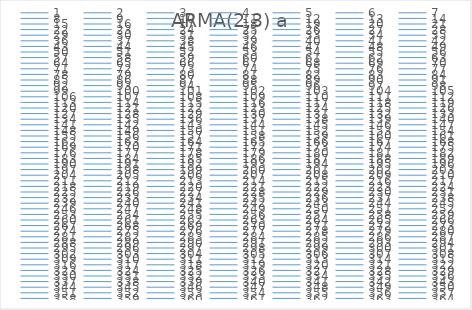
| Category | ARMA(2,3) a  |
|---|---|
| 0.0 | 0 |
| 1.0 | 7.794 |
| 2.0 | 12.601 |
| 3.0 | 17.953 |
| 4.0 | 21.77 |
| 5.0 | 25.87 |
| 6.0 | 32.054 |
| 7.0 | 37.475 |
| 8.0 | 42.303 |
| 9.0 | 49.031 |
| 10.0 | 55.45 |
| 11.0 | 59.478 |
| 12.0 | 64.986 |
| 13.0 | 70.694 |
| 14.0 | 74.901 |
| 15.0 | 79.23 |
| 16.0 | 83.968 |
| 17.0 | 86.77 |
| 18.0 | 88.888 |
| 19.0 | 91.46 |
| 20.0 | 92.942 |
| 21.0 | 94.544 |
| 22.0 | 95.835 |
| 23.0 | 96.282 |
| 24.0 | 96.475 |
| 25.0 | 97.259 |
| 26.0 | 97.453 |
| 27.0 | 96.441 |
| 28.0 | 95.998 |
| 29.0 | 95.129 |
| 30.0 | 95.203 |
| 31.0 | 95.311 |
| 32.0 | 93.866 |
| 33.0 | 91.935 |
| 34.0 | 91.52 |
| 35.0 | 92.834 |
| 36.0 | 94.592 |
| 37.0 | 96.752 |
| 38.0 | 99.857 |
| 39.0 | 101.391 |
| 40.0 | 100.674 |
| 41.0 | 100.138 |
| 42.0 | 100.266 |
| 43.0 | 98.245 |
| 44.0 | 98.259 |
| 45.0 | 98.516 |
| 46.0 | 98.723 |
| 47.0 | 98.543 |
| 48.0 | 100.384 |
| 49.0 | 100.889 |
| 50.0 | 102.037 |
| 51.0 | 103.242 |
| 52.0 | 103.194 |
| 53.0 | 101.319 |
| 54.0 | 100.912 |
| 55.0 | 100.323 |
| 56.0 | 99.451 |
| 57.0 | 99.741 |
| 58.0 | 99.537 |
| 59.0 | 99.758 |
| 60.0 | 98.079 |
| 61.0 | 97.338 |
| 62.0 | 95.978 |
| 63.0 | 93.319 |
| 64.0 | 93.238 |
| 65.0 | 91.168 |
| 66.0 | 92.265 |
| 67.0 | 91.516 |
| 68.0 | 90.677 |
| 69.0 | 91.973 |
| 70.0 | 91.537 |
| 71.0 | 92.245 |
| 72.0 | 92.043 |
| 73.0 | 92.254 |
| 74.0 | 93.431 |
| 75.0 | 94.503 |
| 76.0 | 96.322 |
| 77.0 | 96.967 |
| 78.0 | 98.2 |
| 79.0 | 98.437 |
| 80.0 | 99.387 |
| 81.0 | 99.817 |
| 82.0 | 99.515 |
| 83.0 | 100.018 |
| 84.0 | 100.638 |
| 85.0 | 101.052 |
| 86.0 | 101.987 |
| 87.0 | 101.364 |
| 88.0 | 101.602 |
| 89.0 | 100.753 |
| 90.0 | 100.196 |
| 91.0 | 97.392 |
| 92.0 | 97.691 |
| 93.0 | 98.051 |
| 94.0 | 97.191 |
| 95.0 | 97.803 |
| 96.0 | 96.838 |
| 97.0 | 96.532 |
| 98.0 | 96.48 |
| 99.0 | 99.626 |
| 100.0 | 99.211 |
| 101.0 | 99.186 |
| 102.0 | 98.372 |
| 103.0 | 96.849 |
| 104.0 | 95.379 |
| 105.0 | 93.13 |
| 106.0 | 91.353 |
| 107.0 | 91.171 |
| 108.0 | 90.478 |
| 109.0 | 89.985 |
| 110.0 | 88.52 |
| 111.0 | 87.248 |
| 112.0 | 85.574 |
| 113.0 | 85.933 |
| 114.0 | 86.871 |
| 115.0 | 85.96 |
| 116.0 | 87.074 |
| 117.0 | 85.955 |
| 118.0 | 87.117 |
| 119.0 | 88.237 |
| 120.0 | 88.99 |
| 121.0 | 91.332 |
| 122.0 | 92.473 |
| 123.0 | 94.111 |
| 124.0 | 96.195 |
| 125.0 | 96.07 |
| 126.0 | 98.466 |
| 127.0 | 97.225 |
| 128.0 | 95.275 |
| 129.0 | 93.196 |
| 130.0 | 92.028 |
| 131.0 | 92.406 |
| 132.0 | 92.429 |
| 133.0 | 92.631 |
| 134.0 | 92.942 |
| 135.0 | 92.453 |
| 136.0 | 92.55 |
| 137.0 | 93.86 |
| 138.0 | 93.576 |
| 139.0 | 93.943 |
| 140.0 | 95.942 |
| 141.0 | 98.279 |
| 142.0 | 99.734 |
| 143.0 | 101.28 |
| 144.0 | 103.09 |
| 145.0 | 100.051 |
| 146.0 | 98.867 |
| 147.0 | 99.808 |
| 148.0 | 97.844 |
| 149.0 | 98.317 |
| 150.0 | 99.068 |
| 151.0 | 98.301 |
| 152.0 | 99.457 |
| 153.0 | 101.034 |
| 154.0 | 101.153 |
| 155.0 | 101.041 |
| 156.0 | 98.778 |
| 157.0 | 97.199 |
| 158.0 | 96.054 |
| 159.0 | 94.038 |
| 160.0 | 93.606 |
| 161.0 | 93.676 |
| 162.0 | 94.171 |
| 163.0 | 94.338 |
| 164.0 | 95.591 |
| 165.0 | 96.187 |
| 166.0 | 97.043 |
| 167.0 | 98.848 |
| 168.0 | 100.043 |
| 169.0 | 100.109 |
| 170.0 | 100.928 |
| 171.0 | 100.674 |
| 172.0 | 102.066 |
| 173.0 | 103.141 |
| 174.0 | 102.471 |
| 175.0 | 101.841 |
| 176.0 | 101.892 |
| 177.0 | 99.362 |
| 178.0 | 99.536 |
| 179.0 | 99.466 |
| 180.0 | 97.756 |
| 181.0 | 96.181 |
| 182.0 | 92.699 |
| 183.0 | 91.862 |
| 184.0 | 89.313 |
| 185.0 | 88.378 |
| 186.0 | 88.877 |
| 187.0 | 87.583 |
| 188.0 | 86.966 |
| 189.0 | 87.319 |
| 190.0 | 86.967 |
| 191.0 | 86.343 |
| 192.0 | 85.551 |
| 193.0 | 83.185 |
| 194.0 | 82.953 |
| 195.0 | 83.132 |
| 196.0 | 83.944 |
| 197.0 | 84.589 |
| 198.0 | 87.242 |
| 199.0 | 87.013 |
| 200.0 | 86.541 |
| 201.0 | 87.718 |
| 202.0 | 88.077 |
| 203.0 | 87.853 |
| 204.0 | 87.232 |
| 205.0 | 87.787 |
| 206.0 | 88.393 |
| 207.0 | 89.657 |
| 208.0 | 91.712 |
| 209.0 | 94.129 |
| 210.0 | 95.067 |
| 211.0 | 96.627 |
| 212.0 | 97.468 |
| 213.0 | 96.607 |
| 214.0 | 96.581 |
| 215.0 | 96.264 |
| 216.0 | 94.787 |
| 217.0 | 94.958 |
| 218.0 | 96.608 |
| 219.0 | 95.645 |
| 220.0 | 96.846 |
| 221.0 | 98.18 |
| 222.0 | 97.005 |
| 223.0 | 97.122 |
| 224.0 | 97.414 |
| 225.0 | 96.844 |
| 226.0 | 96.601 |
| 227.0 | 97.396 |
| 228.0 | 96.959 |
| 229.0 | 98.084 |
| 230.0 | 96.511 |
| 231.0 | 94.766 |
| 232.0 | 92.702 |
| 233.0 | 92.402 |
| 234.0 | 93.286 |
| 235.0 | 95.671 |
| 236.0 | 98.337 |
| 237.0 | 100.522 |
| 238.0 | 101.332 |
| 239.0 | 100.406 |
| 240.0 | 102.637 |
| 241.0 | 102.964 |
| 242.0 | 103.839 |
| 243.0 | 102.624 |
| 244.0 | 103.594 |
| 245.0 | 103.27 |
| 246.0 | 103.745 |
| 247.0 | 105.333 |
| 248.0 | 106.592 |
| 249.0 | 106.268 |
| 250.0 | 108.332 |
| 251.0 | 108.424 |
| 252.0 | 110.146 |
| 253.0 | 109.518 |
| 254.0 | 107.796 |
| 255.0 | 105.803 |
| 256.0 | 103.267 |
| 257.0 | 101.583 |
| 258.0 | 100.633 |
| 259.0 | 99.095 |
| 260.0 | 98.099 |
| 261.0 | 98.62 |
| 262.0 | 97.946 |
| 263.0 | 99.392 |
| 264.0 | 99.823 |
| 265.0 | 99.653 |
| 266.0 | 99.159 |
| 267.0 | 99.851 |
| 268.0 | 98.843 |
| 269.0 | 96.77 |
| 270.0 | 95.823 |
| 271.0 | 94.802 |
| 272.0 | 94.42 |
| 273.0 | 95.259 |
| 274.0 | 97.293 |
| 275.0 | 98.367 |
| 276.0 | 99.866 |
| 277.0 | 101.522 |
| 278.0 | 101.975 |
| 279.0 | 101.259 |
| 280.0 | 101.433 |
| 281.0 | 100.038 |
| 282.0 | 100.925 |
| 283.0 | 100.362 |
| 284.0 | 99.09 |
| 285.0 | 98.907 |
| 286.0 | 99.108 |
| 287.0 | 99.378 |
| 288.0 | 100.058 |
| 289.0 | 101.5 |
| 290.0 | 101.778 |
| 291.0 | 102.761 |
| 292.0 | 102.746 |
| 293.0 | 101.994 |
| 294.0 | 99.396 |
| 295.0 | 97.285 |
| 296.0 | 96.743 |
| 297.0 | 96.652 |
| 298.0 | 96.514 |
| 299.0 | 96.416 |
| 300.0 | 94.607 |
| 301.0 | 91.26 |
| 302.0 | 89.824 |
| 303.0 | 87.394 |
| 304.0 | 86.41 |
| 305.0 | 86.211 |
| 306.0 | 86.848 |
| 307.0 | 87.721 |
| 308.0 | 88.198 |
| 309.0 | 88.722 |
| 310.0 | 90.344 |
| 311.0 | 91.469 |
| 312.0 | 93.48 |
| 313.0 | 95.239 |
| 314.0 | 96.633 |
| 315.0 | 98.927 |
| 316.0 | 100.812 |
| 317.0 | 100.829 |
| 318.0 | 102.282 |
| 319.0 | 102.847 |
| 320.0 | 103.233 |
| 321.0 | 104.574 |
| 322.0 | 105.215 |
| 323.0 | 105.237 |
| 324.0 | 104.54 |
| 325.0 | 103.032 |
| 326.0 | 102.627 |
| 327.0 | 103.04 |
| 328.0 | 103.239 |
| 329.0 | 104.67 |
| 330.0 | 104.252 |
| 331.0 | 104.495 |
| 332.0 | 103.368 |
| 333.0 | 102.837 |
| 334.0 | 100.971 |
| 335.0 | 98.34 |
| 336.0 | 97.414 |
| 337.0 | 96.59 |
| 338.0 | 95.409 |
| 339.0 | 96.224 |
| 340.0 | 97.194 |
| 341.0 | 95.798 |
| 342.0 | 94.405 |
| 343.0 | 94.379 |
| 344.0 | 93.211 |
| 345.0 | 92.723 |
| 346.0 | 92.422 |
| 347.0 | 94.069 |
| 348.0 | 95.743 |
| 349.0 | 98.169 |
| 350.0 | 99.267 |
| 351.0 | 98.438 |
| 352.0 | 99.029 |
| 353.0 | 97.824 |
| 354.0 | 98.477 |
| 355.0 | 100.131 |
| 356.0 | 100.512 |
| 357.0 | 101.664 |
| 358.0 | 102.447 |
| 359.0 | 103.948 |
| 360.0 | 103.963 |
| 361.0 | 105.289 |
| 362.0 | 106.718 |
| 363.0 | 106.156 |
| 364.0 | 104.759 |
| 365.0 | 104.92 |
| 366.0 | 104.204 |
| 367.0 | 102.352 |
| 368.0 | 102.318 |
| 369.0 | 101.019 |
| 370.0 | 99.207 |
| 371.0 | 99.741 |
| 372.0 | 98.606 |
| 373.0 | 98.337 |
| 374.0 | 98.57 |
| 375.0 | 97.71 |
| 376.0 | 97.04 |
| 377.0 | 96.796 |
| 378.0 | 97.68 |
| 379.0 | 98.226 |
| 380.0 | 97.89 |
| 381.0 | 97.644 |
| 382.0 | 96.413 |
| 383.0 | 96.186 |
| 384.0 | 95.755 |
| 385.0 | 95.655 |
| 386.0 | 95.546 |
| 387.0 | 94.75 |
| 388.0 | 95.172 |
| 389.0 | 95.201 |
| 390.0 | 98.062 |
| 391.0 | 100.119 |
| 392.0 | 101.105 |
| 393.0 | 101.834 |
| 394.0 | 102.233 |
| 395.0 | 101.495 |
| 396.0 | 104.789 |
| 397.0 | 105.955 |
| 398.0 | 105.728 |
| 399.0 | 107.392 |
| 400.0 | 107.385 |
| 401.0 | 106.813 |
| 402.0 | 106.297 |
| 403.0 | 105.256 |
| 404.0 | 106.105 |
| 405.0 | 105.743 |
| 406.0 | 106.77 |
| 407.0 | 105.737 |
| 408.0 | 104.016 |
| 409.0 | 103.37 |
| 410.0 | 100.733 |
| 411.0 | 100.525 |
| 412.0 | 99.689 |
| 413.0 | 100.581 |
| 414.0 | 102.914 |
| 415.0 | 103.017 |
| 416.0 | 102.82 |
| 417.0 | 101.366 |
| 418.0 | 99.292 |
| 419.0 | 98.487 |
| 420.0 | 98.199 |
| 421.0 | 99.462 |
| 422.0 | 100.151 |
| 423.0 | 99.615 |
| 424.0 | 100.648 |
| 425.0 | 101.061 |
| 426.0 | 101.232 |
| 427.0 | 104.174 |
| 428.0 | 103.922 |
| 429.0 | 105.525 |
| 430.0 | 104.046 |
| 431.0 | 104.14 |
| 432.0 | 105.109 |
| 433.0 | 103.867 |
| 434.0 | 106.16 |
| 435.0 | 105.636 |
| 436.0 | 103.609 |
| 437.0 | 103.386 |
| 438.0 | 100.44 |
| 439.0 | 100.387 |
| 440.0 | 100.865 |
| 441.0 | 100.816 |
| 442.0 | 101.278 |
| 443.0 | 102.147 |
| 444.0 | 102.067 |
| 445.0 | 102.482 |
| 446.0 | 103.689 |
| 447.0 | 103.18 |
| 448.0 | 102.832 |
| 449.0 | 103.72 |
| 450.0 | 103.807 |
| 451.0 | 104.667 |
| 452.0 | 103.83 |
| 453.0 | 101.406 |
| 454.0 | 99.868 |
| 455.0 | 99.044 |
| 456.0 | 99.641 |
| 457.0 | 101.199 |
| 458.0 | 103.271 |
| 459.0 | 102.584 |
| 460.0 | 99.835 |
| 461.0 | 98.465 |
| 462.0 | 97.941 |
| 463.0 | 99.003 |
| 464.0 | 99.6 |
| 465.0 | 98.355 |
| 466.0 | 98.003 |
| 467.0 | 96.402 |
| 468.0 | 94.791 |
| 469.0 | 93.86 |
| 470.0 | 93.522 |
| 471.0 | 93.045 |
| 472.0 | 91.811 |
| 473.0 | 91.972 |
| 474.0 | 92.669 |
| 475.0 | 93.5 |
| 476.0 | 94.275 |
| 477.0 | 95.104 |
| 478.0 | 94.213 |
| 479.0 | 96.005 |
| 480.0 | 96.317 |
| 481.0 | 96.638 |
| 482.0 | 97.378 |
| 483.0 | 97.283 |
| 484.0 | 96.872 |
| 485.0 | 97.48 |
| 486.0 | 96.413 |
| 487.0 | 95.126 |
| 488.0 | 94.881 |
| 489.0 | 93.146 |
| 490.0 | 92.742 |
| 491.0 | 91.813 |
| 492.0 | 90.66 |
| 493.0 | 89.341 |
| 494.0 | 87.45 |
| 495.0 | 86.351 |
| 496.0 | 86.054 |
| 497.0 | 86.694 |
| 498.0 | 87.148 |
| 499.0 | 89.153 |
| 500.0 | 90.181 |
| 501.0 | 90.191 |
| 502.0 | 91.356 |
| 503.0 | 91.626 |
| 504.0 | 91.406 |
| 505.0 | 91.86 |
| 506.0 | 91.315 |
| 507.0 | 90.292 |
| 508.0 | 89.294 |
| 509.0 | 88.329 |
| 510.0 | 88.391 |
| 511.0 | 89.404 |
| 512.0 | 88.589 |
| 513.0 | 89.167 |
| 514.0 | 89.155 |
| 515.0 | 89.405 |
| 516.0 | 90.86 |
| 517.0 | 91.523 |
| 518.0 | 93.345 |
| 519.0 | 95.429 |
| 520.0 | 94.681 |
| 521.0 | 95.037 |
| 522.0 | 93.391 |
| 523.0 | 92.478 |
| 524.0 | 92.962 |
| 525.0 | 91.715 |
| 526.0 | 93.164 |
| 527.0 | 92.343 |
| 528.0 | 92.248 |
| 529.0 | 92.956 |
| 530.0 | 95.204 |
| 531.0 | 96.917 |
| 532.0 | 99.103 |
| 533.0 | 99.238 |
| 534.0 | 99.114 |
| 535.0 | 98.642 |
| 536.0 | 98.955 |
| 537.0 | 100.903 |
| 538.0 | 102.761 |
| 539.0 | 104.758 |
| 540.0 | 105.948 |
| 541.0 | 105.747 |
| 542.0 | 105.977 |
| 543.0 | 105.267 |
| 544.0 | 105.452 |
| 545.0 | 105.096 |
| 546.0 | 102.093 |
| 547.0 | 99.371 |
| 548.0 | 98.91 |
| 549.0 | 97.433 |
| 550.0 | 97.707 |
| 551.0 | 98.564 |
| 552.0 | 98.881 |
| 553.0 | 98.79 |
| 554.0 | 98.073 |
| 555.0 | 98.16 |
| 556.0 | 95.472 |
| 557.0 | 94.852 |
| 558.0 | 95.125 |
| 559.0 | 94.272 |
| 560.0 | 92.674 |
| 561.0 | 90.57 |
| 562.0 | 88.54 |
| 563.0 | 87.387 |
| 564.0 | 86.699 |
| 565.0 | 86.623 |
| 566.0 | 87.115 |
| 567.0 | 87.839 |
| 568.0 | 86.384 |
| 569.0 | 87.203 |
| 570.0 | 86.623 |
| 571.0 | 86.433 |
| 572.0 | 86.751 |
| 573.0 | 86.739 |
| 574.0 | 86.061 |
| 575.0 | 86.723 |
| 576.0 | 87.096 |
| 577.0 | 87.798 |
| 578.0 | 89.187 |
| 579.0 | 89.747 |
| 580.0 | 91.48 |
| 581.0 | 92.597 |
| 582.0 | 93.886 |
| 583.0 | 93.9 |
| 584.0 | 94.078 |
| 585.0 | 95.015 |
| 586.0 | 95.77 |
| 587.0 | 96.316 |
| 588.0 | 97.383 |
| 589.0 | 97.898 |
| 590.0 | 98.571 |
| 591.0 | 99.098 |
| 592.0 | 98.953 |
| 593.0 | 100.144 |
| 594.0 | 99.707 |
| 595.0 | 100.391 |
| 596.0 | 99.139 |
| 597.0 | 97.734 |
| 598.0 | 97.946 |
| 599.0 | 99.033 |
| 600.0 | 101.581 |